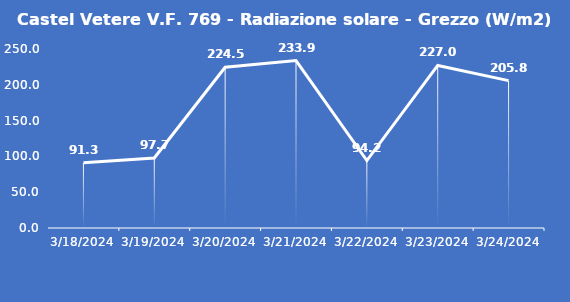
| Category | Castel Vetere V.F. 769 - Radiazione solare - Grezzo (W/m2) |
|---|---|
| 3/18/24 | 91.3 |
| 3/19/24 | 97.7 |
| 3/20/24 | 224.5 |
| 3/21/24 | 233.9 |
| 3/22/24 | 94.2 |
| 3/23/24 | 227 |
| 3/24/24 | 205.8 |